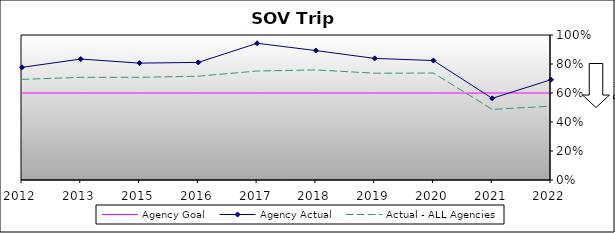
| Category | Agency Goal | Agency Actual | Actual - ALL Agencies |
|---|---|---|---|
| 2012.0 | 0.6 | 0.777 | 0.694 |
| 2013.0 | 0.6 | 0.834 | 0.708 |
| 2015.0 | 0.6 | 0.806 | 0.708 |
| 2016.0 | 0.6 | 0.811 | 0.716 |
| 2017.0 | 0.6 | 0.943 | 0.752 |
| 2018.0 | 0.6 | 0.892 | 0.759 |
| 2019.0 | 0.6 | 0.839 | 0.736 |
| 2020.0 | 0.6 | 0.824 | 0.737 |
| 2021.0 | 0.6 | 0.563 | 0.487 |
| 2022.0 | 0.6 | 0.692 | 0.509 |